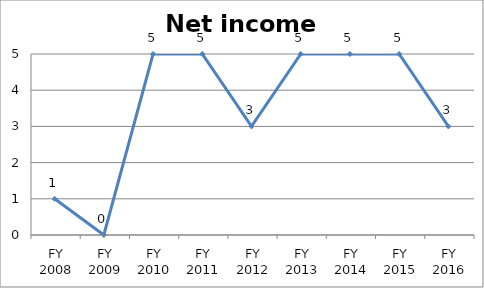
| Category | Net income score |
|---|---|
| FY 2016 | 3 |
| FY 2015 | 5 |
| FY 2014 | 5 |
| FY 2013 | 5 |
| FY 2012 | 3 |
| FY 2011 | 5 |
| FY 2010 | 5 |
| FY 2009 | 0 |
| FY 2008 | 1 |